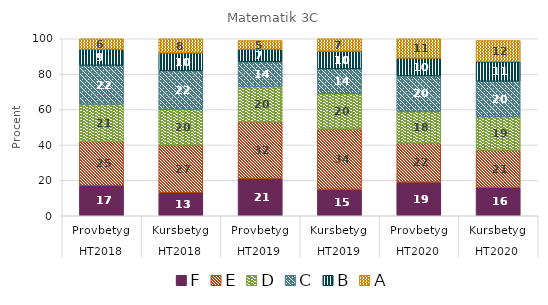
| Category | F | E | D | C | B | A |
|---|---|---|---|---|---|---|
| 0 | 17 | 25 | 21 | 22 | 9 | 6 |
| 1 | 13 | 27 | 20 | 22 | 10 | 8 |
| 2 | 21 | 32 | 20 | 14 | 7 | 5 |
| 3 | 15 | 34 | 20 | 14 | 10 | 7 |
| 4 | 19 | 22 | 18 | 20 | 10 | 11 |
| 5 | 16 | 21 | 19 | 20 | 11 | 12 |